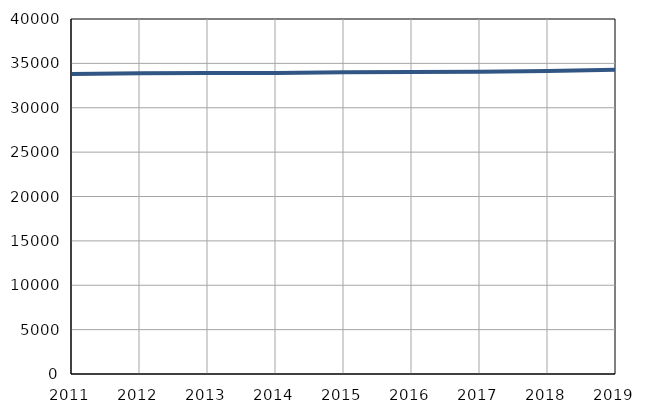
| Category | Број
становника |
|---|---|
| 2011.0 | 33802 |
| 2012.0 | 33886 |
| 2013.0 | 33916 |
| 2014.0 | 33920 |
| 2015.0 | 33988 |
| 2016.0 | 34041 |
| 2017.0 | 34055 |
| 2018.0 | 34150 |
| 2019.0 | 34281 |